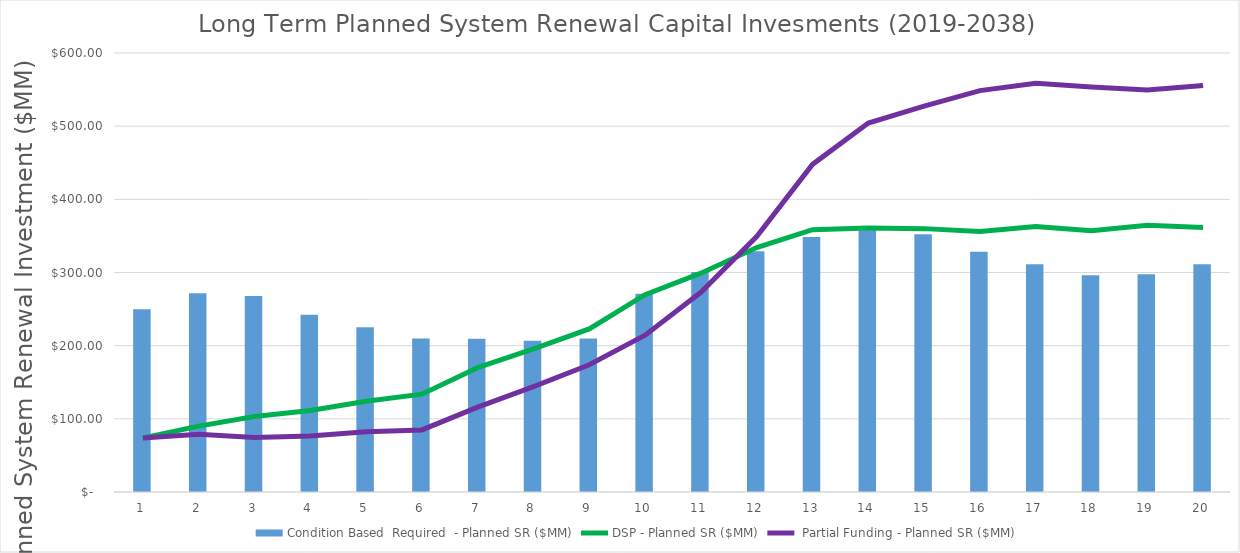
| Category | Condition Based  Required  - Planned SR ($MM) |
|---|---|
| 0 | 249.786 |
| 1 | 271.489 |
| 2 | 267.749 |
| 3 | 242.419 |
| 4 | 225.116 |
| 5 | 209.923 |
| 6 | 209.374 |
| 7 | 206.59 |
| 8 | 209.726 |
| 9 | 271.037 |
| 10 | 300.551 |
| 11 | 328.887 |
| 12 | 348.66 |
| 13 | 357.67 |
| 14 | 352.113 |
| 15 | 328.507 |
| 16 | 311.232 |
| 17 | 296.119 |
| 18 | 297.567 |
| 19 | 311.317 |